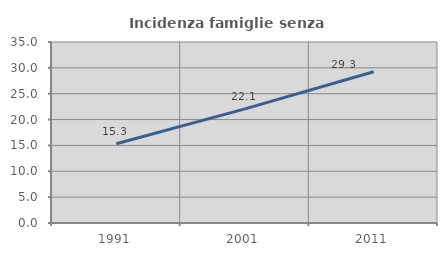
| Category | Incidenza famiglie senza nuclei |
|---|---|
| 1991.0 | 15.325 |
| 2001.0 | 22.059 |
| 2011.0 | 29.258 |